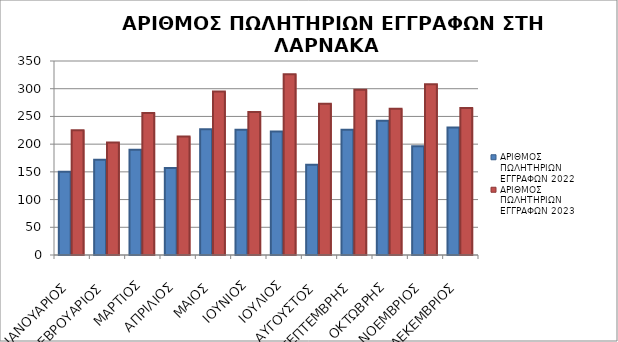
| Category | Συνολικό Αποδεχθέν Ποσό Υποθεσέων Ν81/70 (με επιτόπια έρευνα): | ΑΡΙΘΜΟΣ ΠΩΛΗΤΗΡΙΩΝ ΕΓΓΡΑΦΩΝ 2022 | ΑΡΙΘΜΟΣ ΠΩΛΗΤΗΡΙΩΝ ΕΓΓΡΑΦΩΝ 2023 |
|---|---|---|---|
| ΙΑΝΟΥΑΡΙΟΣ |  | 150 | 225 |
| ΦΕΒΡΟΥΑΡΙΟΣ |  | 172 | 203 |
| ΜΑΡΤΙΟΣ |  | 190 | 256 |
| ΑΠΡΙΛΙΟΣ |  | 157 | 214 |
| ΜΑΙΟΣ |  | 227 | 295 |
| ΙΟΥΝΙΟΣ |  | 226 | 258 |
| ΙΟΥΛΙΟΣ |  | 223 | 326 |
| ΑΥΓΟΥΣΤΟΣ |  | 163 | 273 |
| ΣΕΠΤΕΜΒΡΗΣ |  | 226 | 298 |
| ΟΚΤΩΒΡΗΣ |  | 242 | 264 |
| ΝΟΕΜΒΡΙΟΣ |  | 196 | 308 |
| ΔΕΚΕΜΒΡΙΟΣ |  | 230 | 265 |